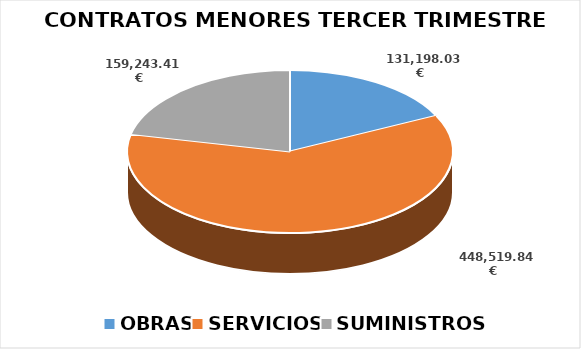
| Category | Series 0 |
|---|---|
| OBRAS | 131198.03 |
| SERVICIOS  | 448519.84 |
| SUMINISTROS | 159243.41 |